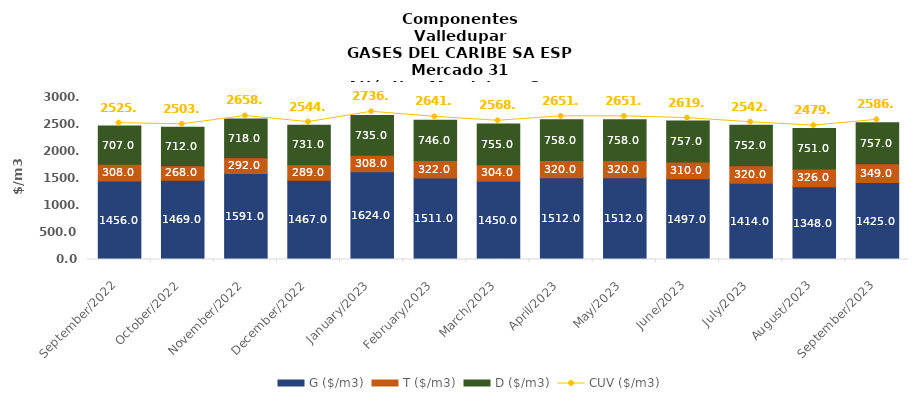
| Category | G ($/m3) | T ($/m3) | D ($/m3) |
|---|---|---|---|
| 2022-09-01 | 1456 | 308 | 707 |
| 2022-10-01 | 1469 | 268 | 712 |
| 2022-11-01 | 1591 | 292 | 718 |
| 2022-12-01 | 1467 | 289 | 731 |
| 2023-01-01 | 1624 | 308 | 735 |
| 2023-02-01 | 1511 | 322 | 746 |
| 2023-03-01 | 1450 | 304 | 755 |
| 2023-04-01 | 1512 | 320 | 758 |
| 2023-05-01 | 1512 | 320 | 758 |
| 2023-06-01 | 1497 | 310 | 757 |
| 2023-07-01 | 1414 | 320 | 752 |
| 2023-08-01 | 1348 | 326 | 751 |
| 2023-09-01 | 1425 | 349 | 757 |